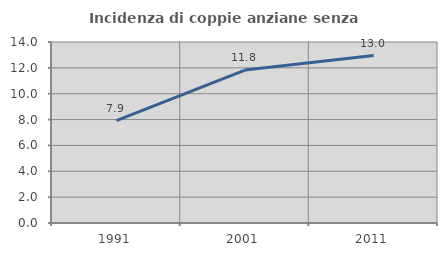
| Category | Incidenza di coppie anziane senza figli  |
|---|---|
| 1991.0 | 7.923 |
| 2001.0 | 11.831 |
| 2011.0 | 12.953 |